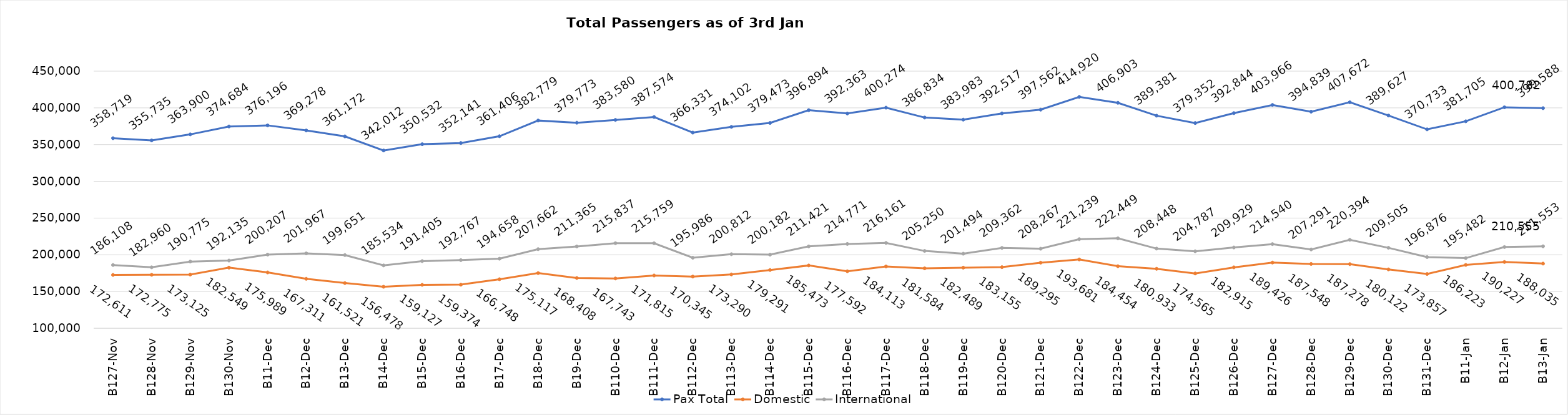
| Category | Pax Total | Domestic | International |
|---|---|---|---|
| 2023-11-27 | 358719 | 172611 | 186108 |
| 2023-11-28 | 355735 | 172775 | 182960 |
| 2023-11-29 | 363900 | 173125 | 190775 |
| 2023-11-30 | 374684 | 182549 | 192135 |
| 2023-12-01 | 376196 | 175989 | 200207 |
| 2023-12-02 | 369278 | 167311 | 201967 |
| 2023-12-03 | 361172 | 161521 | 199651 |
| 2023-12-04 | 342012 | 156478 | 185534 |
| 2023-12-05 | 350532 | 159127 | 191405 |
| 2023-12-06 | 352141 | 159374 | 192767 |
| 2023-12-07 | 361406 | 166748 | 194658 |
| 2023-12-08 | 382779 | 175117 | 207662 |
| 2023-12-09 | 379773 | 168408 | 211365 |
| 2023-12-10 | 383580 | 167743 | 215837 |
| 2023-12-11 | 387574 | 171815 | 215759 |
| 2023-12-12 | 366331 | 170345 | 195986 |
| 2023-12-13 | 374102 | 173290 | 200812 |
| 2023-12-14 | 379473 | 179291 | 200182 |
| 2023-12-15 | 396894 | 185473 | 211421 |
| 2023-12-16 | 392363 | 177592 | 214771 |
| 2023-12-17 | 400274 | 184113 | 216161 |
| 2023-12-18 | 386834 | 181584 | 205250 |
| 2023-12-19 | 383983 | 182489 | 201494 |
| 2023-12-20 | 392517 | 183155 | 209362 |
| 2023-12-21 | 397562 | 189295 | 208267 |
| 2023-12-22 | 414920 | 193681 | 221239 |
| 2023-12-23 | 406903 | 184454 | 222449 |
| 2023-12-24 | 389381 | 180933 | 208448 |
| 2023-12-25 | 379352 | 174565 | 204787 |
| 2023-12-26 | 392844 | 182915 | 209929 |
| 2023-12-27 | 403966 | 189426 | 214540 |
| 2023-12-28 | 394839 | 187548 | 207291 |
| 2023-12-29 | 407672 | 187278 | 220394 |
| 2023-12-30 | 389627 | 180122 | 209505 |
| 2023-12-31 | 370733 | 173857 | 196876 |
| 2024-01-01 | 381705 | 186223 | 195482 |
| 2024-01-02 | 400782 | 190227 | 210555 |
| 2024-01-03 | 399588 | 188035 | 211553 |